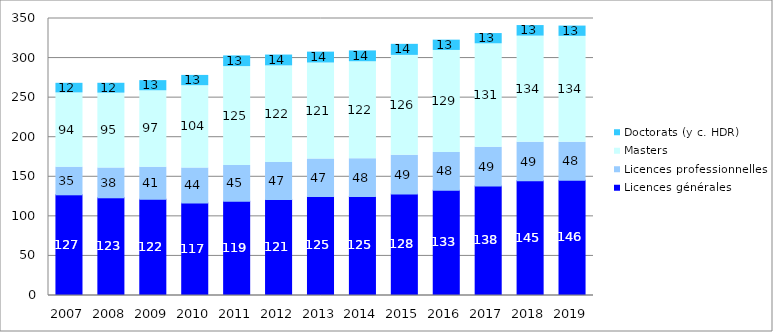
| Category | Licences générales | Licences professionnelles | Masters | Doctorats (y c. HDR) |
|---|---|---|---|---|
| 2007.0 | 127.232 | 34.915 | 93.83 | 12.129 |
| 2008.0 | 123.465 | 37.665 | 94.546 | 12.476 |
| 2009.0 | 121.592 | 40.52 | 96.566 | 12.824 |
| 2010.0 | 116.996 | 44.235 | 103.861 | 12.988 |
| 2011.0 | 118.959 | 45.378 | 124.903 | 13.489 |
| 2012.0 | 121.326 | 46.76 | 122.044 | 13.686 |
| 2013.0 | 125.163 | 47.304 | 121.298 | 13.748 |
| 2014.0 | 125.19 | 47.749 | 122.426 | 13.675 |
| 2015.0 | 128.396 | 48.744 | 126.262 | 13.957 |
| 2016.0 | 133.053 | 47.777 | 128.815 | 13.008 |
| 2017.0 | 138.499 | 48.823 | 130.716 | 12.939 |
| 2018.0 | 144.838 | 48.753 | 134.173 | 13.314 |
| 2019.0 | 145.629 | 47.979 | 133.842 | 12.988 |